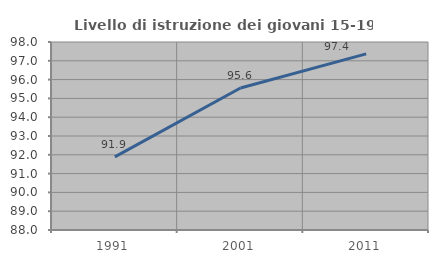
| Category | Livello di istruzione dei giovani 15-19 anni |
|---|---|
| 1991.0 | 91.892 |
| 2001.0 | 95.556 |
| 2011.0 | 97.368 |